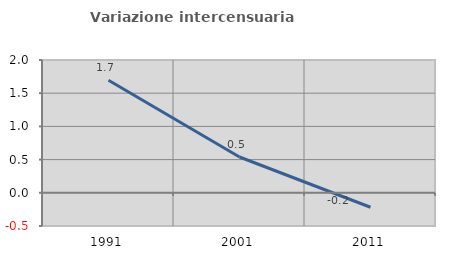
| Category | Variazione intercensuaria annua |
|---|---|
| 1991.0 | 1.694 |
| 2001.0 | 0.539 |
| 2011.0 | -0.218 |